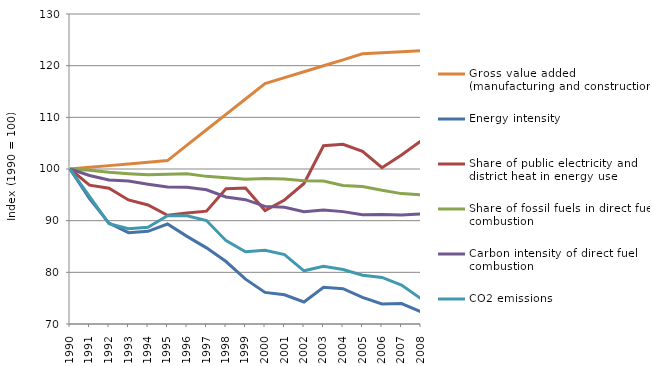
| Category | Gross value added (manufacturing and construction) | Energy intensity | Share of public electricity and district heat in energy use | Share of fossil fuels in direct fuel combustion | Carbon intensity of direct fuel combustion | CO2 emissions |
|---|---|---|---|---|---|---|
| 1990.0 | 100 | 100 | 100 | 100 | 100 | 100 |
| 1991.0 | 100.326 | 94.265 | 96.864 | 99.745 | 98.741 | 94.715 |
| 1992.0 | 100.652 | 89.536 | 96.286 | 99.378 | 97.86 | 89.394 |
| 1993.0 | 100.979 | 87.678 | 94.011 | 99.103 | 97.655 | 88.444 |
| 1994.0 | 101.305 | 87.931 | 93.036 | 98.901 | 97.055 | 88.708 |
| 1995.0 | 101.631 | 89.349 | 91.048 | 98.991 | 96.535 | 90.954 |
| 1996.0 | 104.609 | 86.962 | 91.463 | 99.061 | 96.475 | 90.932 |
| 1997.0 | 107.587 | 84.733 | 91.843 | 98.574 | 95.975 | 90.028 |
| 1998.0 | 110.565 | 82.094 | 96.192 | 98.303 | 94.589 | 86.128 |
| 1999.0 | 113.543 | 78.673 | 96.335 | 98.005 | 94.059 | 83.968 |
| 2000.0 | 116.521 | 76.116 | 91.967 | 98.181 | 92.766 | 84.268 |
| 2001.0 | 117.674 | 75.65 | 94.009 | 98.078 | 92.576 | 83.432 |
| 2002.0 | 118.827 | 74.269 | 97.194 | 97.708 | 91.734 | 80.295 |
| 2003.0 | 119.98 | 77.121 | 104.502 | 97.657 | 92.045 | 81.159 |
| 2004.0 | 121.133 | 76.839 | 104.796 | 96.821 | 91.75 | 80.552 |
| 2005.0 | 122.286 | 75.153 | 103.431 | 96.61 | 91.156 | 79.441 |
| 2006.0 | 122.49 | 73.885 | 100.25 | 95.873 | 91.196 | 79.022 |
| 2007.0 | 122.694 | 73.946 | 102.703 | 95.234 | 91.075 | 77.548 |
| 2008.0 | 122.899 | 72.374 | 105.46 | 95.014 | 91.299 | 74.893 |